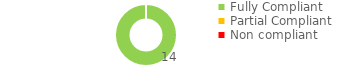
| Category | Series 0 |
|---|---|
| Fully Compliant | 14 |
| Partial Compliant | 0 |
| Non compliant | 0 |